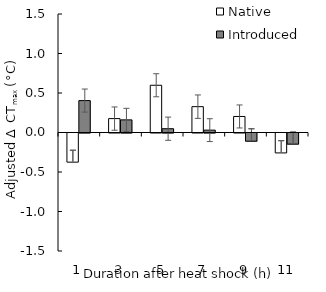
| Category | Native | Introduced |
|---|---|---|
| 1.0 | -0.369 | 0.404 |
| 3.0 | 0.176 | 0.16 |
| 5.0 | 0.598 | 0.048 |
| 7.0 | 0.327 | 0.03 |
| 9.0 | 0.203 | -0.104 |
| 11.0 | -0.252 | -0.141 |